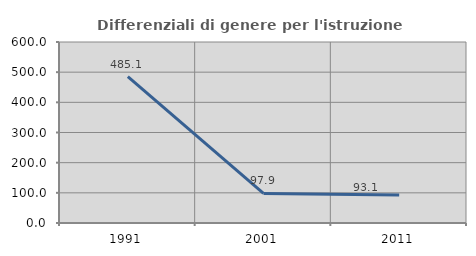
| Category | Differenziali di genere per l'istruzione superiore |
|---|---|
| 1991.0 | 485.149 |
| 2001.0 | 97.896 |
| 2011.0 | 93.103 |